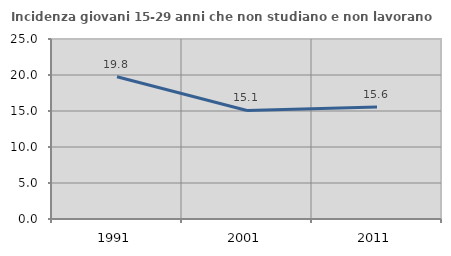
| Category | Incidenza giovani 15-29 anni che non studiano e non lavorano  |
|---|---|
| 1991.0 | 19.753 |
| 2001.0 | 15.077 |
| 2011.0 | 15.571 |